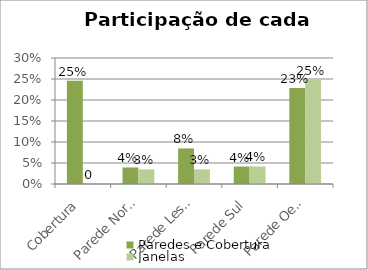
| Category | Paredes e Cobertura | Janelas |
|---|---|---|
| Cobertura | 0.246 | 0 |
| Parede Norte | 0.039 | 0.035 |
| Parede Leste | 0.085 | 0.035 |
| Parede Sul | 0.042 | 0.042 |
| Parede Oeste | 0.229 | 0.248 |